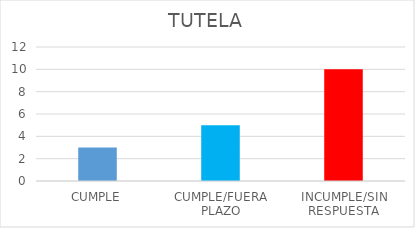
| Category | TOTAL |
|---|---|
| CUMPLE | 3 |
| CUMPLE/FUERA PLAZO | 5 |
| INCUMPLE/SIN RESPUESTA | 10 |